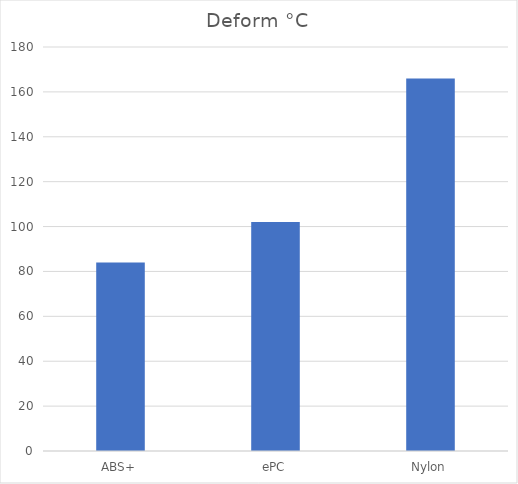
| Category | Deform °C |
|---|---|
| ABS+ | 84 |
| ePC | 102 |
| Nylon | 166 |